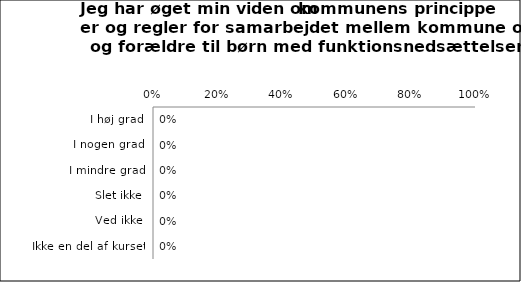
| Category | Øget viden om kommunenes principper og regler for samarbejdet mellem kommune og forældre til børn med funktionsnedsættelse |
|---|---|
| I høj grad | 0 |
| I nogen grad | 0 |
| I mindre grad | 0 |
| Slet ikke | 0 |
| Ved ikke | 0 |
| Ikke en del af kurset | 0 |